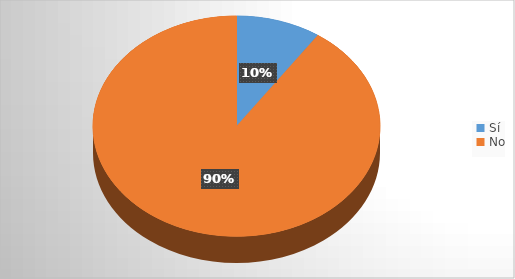
| Category | Series 0 |
|---|---|
| Sí | 11 |
| No | 104 |